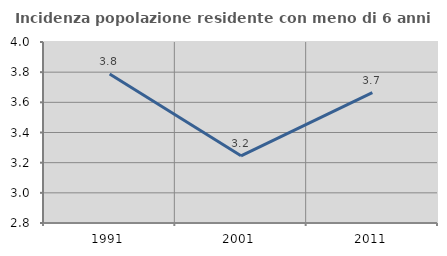
| Category | Incidenza popolazione residente con meno di 6 anni |
|---|---|
| 1991.0 | 3.788 |
| 2001.0 | 3.245 |
| 2011.0 | 3.665 |